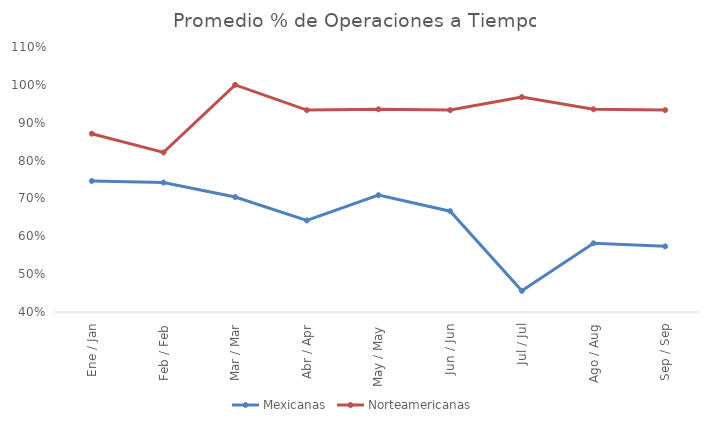
| Category | Mexicanas | Norteamericanas |
|---|---|---|
| Ene / Jan | 0.746 | 0.871 |
| Feb / Feb | 0.742 | 0.821 |
| Mar / Mar | 0.704 | 1 |
| Abr / Apr | 0.642 | 0.933 |
| May / May | 0.709 | 0.935 |
| Jun / Jun | 0.666 | 0.933 |
| Jul / Jul | 0.456 | 0.968 |
| Ago / Aug | 0.582 | 0.935 |
| Sep / Sep | 0.573 | 0.933 |